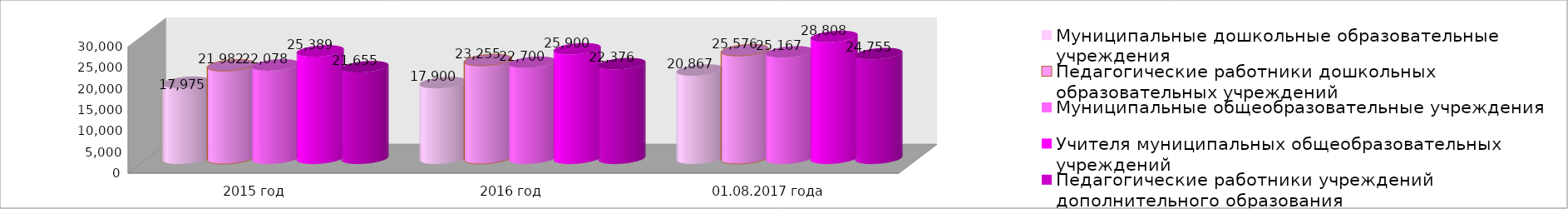
| Category | Муниципальные дошкольные образовательные учреждения | Педагогические работники дошкольных образовательных учреждений | Муниципальные общеобразовательные учреждения | Учителя муниципальных общеобразовательных учреждений | Педагогические работники учреждений дополнительного образования |
|---|---|---|---|---|---|
| 2015 год | 17975 | 21982 | 22078 | 25389 | 21655 |
| 2016 год | 17900 | 23255 | 22700 | 25900 | 22376 |
| 01.08.2017 года | 20867 | 25576 | 25167 | 28808 | 24755 |